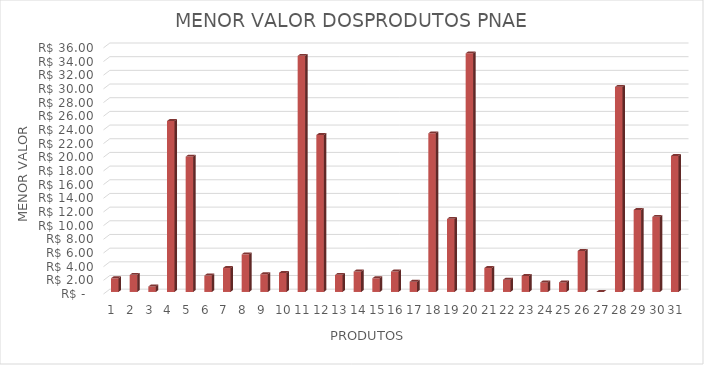
| Category | Series 0 |
|---|---|
| 0 | 2 |
| 1 | 2.5 |
| 2 | 0.8 |
| 3 | 25 |
| 4 | 19.8 |
| 5 | 2.4 |
| 6 | 3.5 |
| 7 | 5.5 |
| 8 | 2.59 |
| 9 | 2.79 |
| 10 | 34.53 |
| 11 | 22.95 |
| 12 | 2.5 |
| 13 | 2.99 |
| 14 | 2 |
| 15 | 2.99 |
| 16 | 1.5 |
| 17 | 23.2 |
| 18 | 10.69 |
| 19 | 34.9 |
| 20 | 3.5 |
| 21 | 1.79 |
| 22 | 2.35 |
| 23 | 1.4 |
| 24 | 1.4 |
| 25 | 6 |
| 26 | 0 |
| 27 | 30 |
| 28 | 12 |
| 29 | 10.99 |
| 30 | 19.9 |